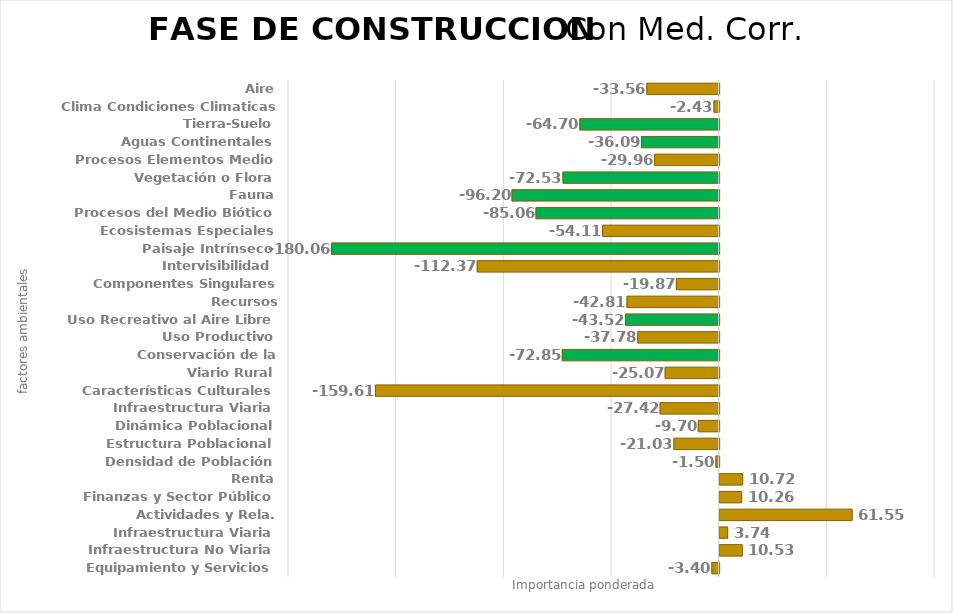
| Category | Series 0 |
|---|---|
| Aire | -33.564 |
| Clima Condiciones Climaticas | -2.432 |
| Tierra-Suelo | -64.696 |
| Aguas Continentales | -36.093 |
| Procesos Elementos Medio | -29.964 |
| Vegetación o Flora | -72.529 |
| Fauna | -96.199 |
| Procesos del Medio Biótico | -85.06 |
| Ecosistemas Especiales | -54.112 |
| Paisaje Intrínseco | -180.058 |
| Intervisibilidad | -112.366 |
| Componentes Singulares Paisaje | -19.874 |
| Recursos Científico-Culturales | -42.806 |
| Uso Recreativo al Aire Libre | -43.521 |
| Uso Productivo | -37.776 |
| Conservación de la Naturaleza | -72.854 |
| Viario Rural | -25.068 |
| Características Culturales | -159.614 |
| Infraestructura Viaria | -27.418 |
| Dinámica Poblacional | -9.7 |
| Estructura Poblacional | -21.028 |
| Densidad de Población | -1.502 |
| Renta | 10.725 |
| Finanzas y Sector Público | 10.259 |
| Actividades y Rela. Económicas | 61.551 |
| Infraestructura Viaria | 3.737 |
| Infraestructura No Viaria | 10.532 |
| Equipamiento y Servicios | -3.397 |